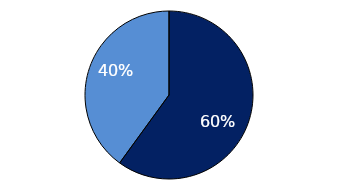
| Category | Series 0 |
|---|---|
| Percentage of optometry practices that were accredited | 0.6 |
| Percentage of optometry practices that were not accredited | 0.4 |